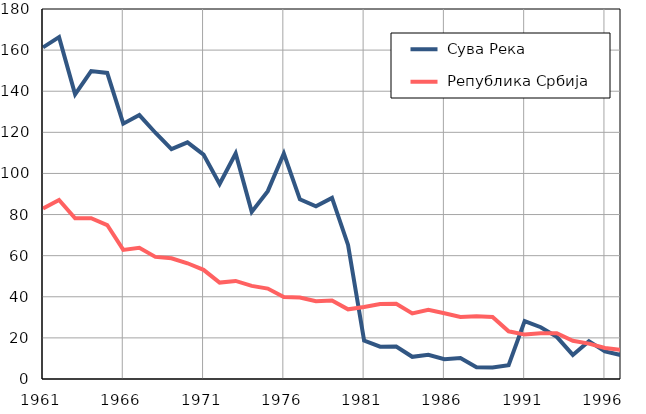
| Category |  Сува Река |  Република Србија |
|---|---|---|
| 1961.0 | 161.3 | 82.9 |
| 1962.0 | 166.3 | 87.1 |
| 1963.0 | 138.5 | 78.2 |
| 1964.0 | 149.8 | 78.2 |
| 1965.0 | 148.9 | 74.9 |
| 1966.0 | 124.2 | 62.8 |
| 1967.0 | 128.4 | 63.8 |
| 1968.0 | 119.8 | 59.4 |
| 1969.0 | 111.8 | 58.7 |
| 1970.0 | 115.1 | 56.3 |
| 1971.0 | 109.2 | 53.1 |
| 1972.0 | 94.9 | 46.9 |
| 1973.0 | 109.7 | 47.7 |
| 1974.0 | 81.3 | 45.3 |
| 1975.0 | 91.4 | 44 |
| 1976.0 | 109.7 | 39.9 |
| 1977.0 | 87.4 | 39.6 |
| 1978.0 | 84 | 37.8 |
| 1979.0 | 88.1 | 38.2 |
| 1980.0 | 65.2 | 33.9 |
| 1981.0 | 18.7 | 35 |
| 1982.0 | 15.7 | 36.5 |
| 1983.0 | 15.8 | 36.6 |
| 1984.0 | 10.8 | 31.9 |
| 1985.0 | 11.8 | 33.7 |
| 1986.0 | 9.6 | 32 |
| 1987.0 | 10.2 | 30.2 |
| 1988.0 | 5.7 | 30.5 |
| 1989.0 | 5.6 | 30.2 |
| 1990.0 | 6.7 | 23.2 |
| 1991.0 | 28.2 | 21.6 |
| 1992.0 | 25.2 | 22.3 |
| 1993.0 | 20.5 | 22.3 |
| 1994.0 | 11.7 | 18.6 |
| 1995.0 | 18.4 | 17.2 |
| 1996.0 | 13.4 | 15.1 |
| 1997.0 | 11.6 | 14.2 |